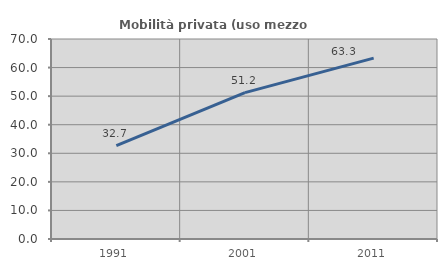
| Category | Mobilità privata (uso mezzo privato) |
|---|---|
| 1991.0 | 32.69 |
| 2001.0 | 51.215 |
| 2011.0 | 63.299 |